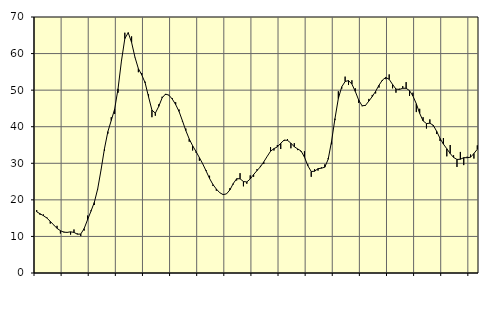
| Category | Piggar | Series 1 |
|---|---|---|
| nan | 17.2 | 16.74 |
| 87.0 | 15.9 | 16.19 |
| 87.0 | 16 | 15.67 |
| 87.0 | 15.2 | 15.03 |
| nan | 13.5 | 14.12 |
| 88.0 | 13.1 | 13.16 |
| 88.0 | 12.9 | 12.21 |
| 88.0 | 10.8 | 11.57 |
| nan | 11.3 | 11.16 |
| 89.0 | 11.2 | 11.11 |
| 89.0 | 10.5 | 11.26 |
| 89.0 | 11.9 | 11.1 |
| nan | 10.8 | 10.61 |
| 90.0 | 10.1 | 10.65 |
| 90.0 | 11.6 | 12.15 |
| 90.0 | 15.7 | 14.55 |
| nan | 17.1 | 16.88 |
| 91.0 | 18.6 | 19.32 |
| 91.0 | 22.9 | 23 |
| 91.0 | 28.3 | 28.25 |
| nan | 33.4 | 34.02 |
| 92.0 | 38.1 | 38.66 |
| 92.0 | 42.6 | 41.72 |
| 92.0 | 43.5 | 44.8 |
| nan | 49.3 | 50.37 |
| 93.0 | 58 | 57.94 |
| 93.0 | 65.7 | 64.07 |
| 93.0 | 65.6 | 65.72 |
| nan | 64.7 | 63.04 |
| 94.0 | 58.9 | 58.97 |
| 94.0 | 54.9 | 55.88 |
| 94.0 | 54.7 | 54.17 |
| nan | 52.3 | 52 |
| 95.0 | 48.9 | 48.16 |
| 95.0 | 42.6 | 44.56 |
| 95.0 | 43 | 43.71 |
| nan | 46.1 | 45.54 |
| 96.0 | 48.2 | 47.88 |
| 96.0 | 48.7 | 48.92 |
| 96.0 | 48.7 | 48.63 |
| nan | 47.8 | 47.56 |
| 97.0 | 46.7 | 46.06 |
| 97.0 | 44.7 | 44.18 |
| 97.0 | 41.4 | 41.62 |
| nan | 39.5 | 38.94 |
| 98.0 | 35.9 | 36.66 |
| 98.0 | 33.5 | 34.81 |
| 98.0 | 32.9 | 33.23 |
| nan | 30.7 | 31.56 |
| 99.0 | 29.8 | 29.81 |
| 99.0 | 28.1 | 27.87 |
| 99.0 | 26.6 | 25.85 |
| nan | 23.8 | 24.19 |
| 0.0 | 22.5 | 22.96 |
| 0.0 | 22 | 21.96 |
| 0.0 | 21.4 | 21.44 |
| nan | 21.6 | 21.63 |
| 1.0 | 23.2 | 22.71 |
| 1.0 | 24.2 | 24.47 |
| 1.0 | 25.3 | 25.78 |
| nan | 27.3 | 25.76 |
| 2.0 | 23.7 | 25.01 |
| 2.0 | 24.4 | 24.9 |
| 2.0 | 26.7 | 25.7 |
| nan | 26.3 | 26.93 |
| 3.0 | 28.4 | 28 |
| 3.0 | 29.3 | 29.04 |
| 3.0 | 29.8 | 30.39 |
| nan | 31.9 | 31.88 |
| 4.0 | 34.4 | 33.3 |
| 4.0 | 33.5 | 34.01 |
| 4.0 | 35 | 34.47 |
| nan | 33.9 | 35.48 |
| 5.0 | 36.1 | 36.34 |
| 5.0 | 36.6 | 36.27 |
| 5.0 | 34.1 | 35.5 |
| nan | 35.5 | 34.52 |
| 6.0 | 33.6 | 33.93 |
| 6.0 | 33.2 | 33.36 |
| 6.0 | 33.3 | 31.71 |
| nan | 29.7 | 29.33 |
| 7.0 | 26.3 | 27.75 |
| 7.0 | 28.4 | 27.83 |
| 7.0 | 28 | 28.53 |
| nan | 28.9 | 28.65 |
| 8.0 | 29.7 | 28.93 |
| 8.0 | 31.4 | 31.1 |
| 8.0 | 35.2 | 36.01 |
| nan | 41.8 | 42.21 |
| 9.0 | 49.7 | 47.71 |
| 9.0 | 50.4 | 50.9 |
| 9.0 | 53.7 | 52.36 |
| nan | 51.4 | 52.61 |
| 10.0 | 52.7 | 51.65 |
| 10.0 | 50.5 | 49.65 |
| 10.0 | 46.5 | 47.29 |
| nan | 45.6 | 45.73 |
| 11.0 | 45.7 | 45.82 |
| 11.0 | 47.6 | 47.01 |
| 11.0 | 48.7 | 48.24 |
| nan | 49.1 | 49.69 |
| 12.0 | 50.7 | 51.35 |
| 12.0 | 52.5 | 52.75 |
| 12.0 | 53 | 53.47 |
| nan | 54.3 | 52.96 |
| 13.0 | 50.5 | 51.56 |
| 13.0 | 49.3 | 50.29 |
| 13.0 | 50.4 | 50.19 |
| nan | 51.1 | 50.51 |
| 14.0 | 52.2 | 50.51 |
| 14.0 | 48.4 | 49.86 |
| 14.0 | 49.3 | 48.41 |
| nan | 44 | 46.28 |
| 15.0 | 44.9 | 43.66 |
| 15.0 | 42.6 | 41.6 |
| 15.0 | 39.5 | 40.86 |
| nan | 42 | 40.96 |
| 16.0 | 40.1 | 40.4 |
| 16.0 | 38 | 38.76 |
| 16.0 | 36.1 | 36.81 |
| nan | 36.9 | 35.24 |
| 17.0 | 31.9 | 33.98 |
| 17.0 | 35 | 32.66 |
| 17.0 | 32.2 | 31.6 |
| nan | 29 | 31.05 |
| 18.0 | 33.1 | 31.1 |
| 18.0 | 29.5 | 31.54 |
| 18.0 | 31.8 | 31.52 |
| nan | 32.4 | 31.66 |
| 19.0 | 31.3 | 32.68 |
| 19.0 | 34.9 | 33.83 |